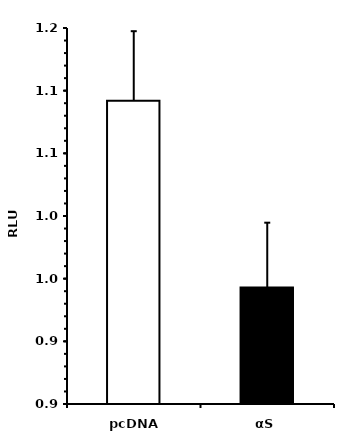
| Category | Series 0 |
|---|---|
| pcDNA | 1.092 |
| αS | 0.943 |